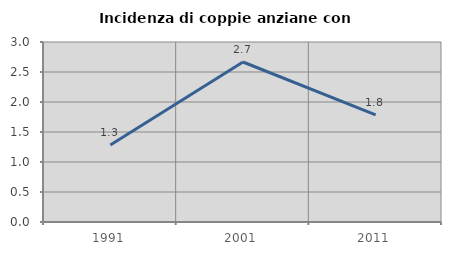
| Category | Incidenza di coppie anziane con figli |
|---|---|
| 1991.0 | 1.282 |
| 2001.0 | 2.667 |
| 2011.0 | 1.786 |